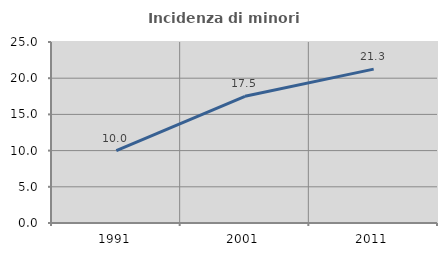
| Category | Incidenza di minori stranieri |
|---|---|
| 1991.0 | 10 |
| 2001.0 | 17.5 |
| 2011.0 | 21.25 |